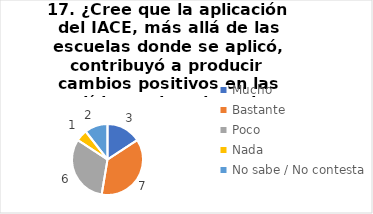
| Category | 17. ¿Cree que la aplicación del IACE, más allá de las escuelas donde se aplicó, contribuyó a producir cambios positivos en las políticas educativas de su provincia? |
|---|---|
| Mucho  | 0.158 |
| Bastante  | 0.368 |
| Poco  | 0.316 |
| Nada  | 0.053 |
| No sabe / No contesta | 0.105 |